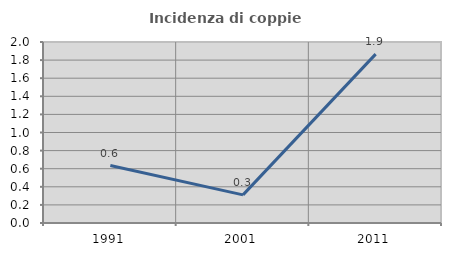
| Category | Incidenza di coppie miste |
|---|---|
| 1991.0 | 0.635 |
| 2001.0 | 0.311 |
| 2011.0 | 1.866 |